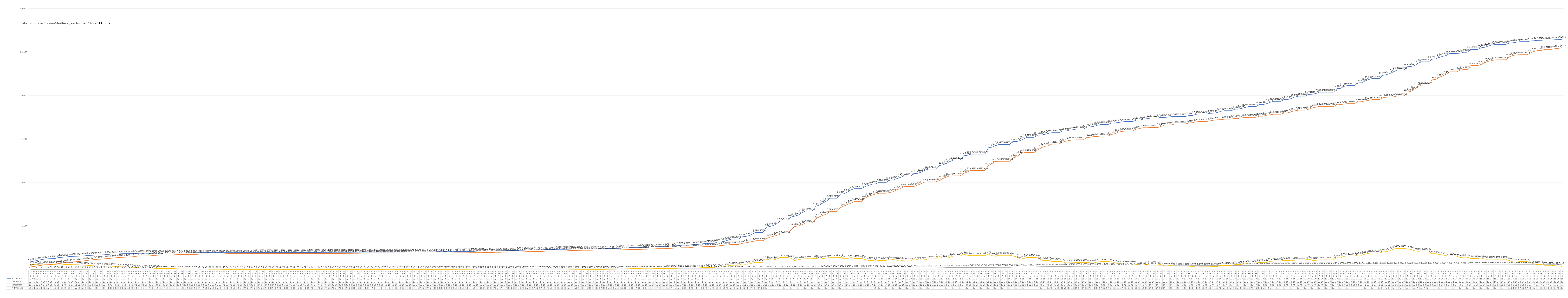
| Category | Positiv Getestete | Genesene | Verstorbene | Aktive Fälle |
|---|---|---|---|---|
| 3/31/20 | 922 | 322 | 15 | 585 |
| 4/1/20 | 980 | 364 | 16 | 600 |
| 4/2/20 | 1081 | 435 | 21 | 625 |
| 4/3/20 | 1155 | 494 | 27 | 634 |
| 4/4/20 | 1213 | 560 | 27 | 626 |
| 4/5/20 | 1259 | 578 | 27 | 654 |
| 4/6/20 | 1272 | 595 | 35 | 642 |
| 4/7/20 | 1295 | 662 | 35 | 598 |
| 4/8/20 | 1399 | 699 | 36 | 664 |
| 4/9/20 | 1426 | 755 | 41 | 630 |
| 4/10/20 | 1465 | 826 | 48 | 591 |
| 4/11/20 | 1508 | 854 | 50 | 604 |
| 4/12/20 | 1532 | 906 | 51 | 575 |
| 4/13/20 | 1547 | 922 | 51 | 574 |
| 4/14/20 | 1557 | 949 | 52 | 556 |
| 4/15/20 | 1583 | 1009 | 54 | 520 |
| 4/16/20 | 1623 | 1058 | 56 | 509 |
| 4/17/20 | 1650 | 1112 | 59 | 479 |
| 4/18/20 | 1669 | 1159 | 62 | 448 |
| 4/19/20 | 1693 | 1195 | 62 | 436 |
| 4/20/20 | 1707 | 1201 | 63 | 443 |
| 4/21/20 | 1719 | 1256 | 65 | 398 |
| 4/22/20 | 1754 | 1281 | 70 | 403 |
| 4/23/20 | 1797 | 1324 | 73 | 400 |
| 4/24/20 | 1812 | 1357 | 74 | 381 |
| 4/25/20 | 1824 | 1412 | 75 | 337 |
| 4/26/20 | 1835 | 1420 | 76 | 339 |
| 4/27/20 | 1839 | 1435 | 76 | 328 |
| 4/28/20 | 1845 | 1467 | 78 | 300 |
| 4/29/20 | 1853 | 1490 | 79 | 284 |
| 4/30/20 | 1866 | 1535 | 82 | 249 |
| 5/1/20 | 1891 | 1591 | 83 | 217 |
| 5/2/20 | 1891 | 1591 | 83 | 217 |
| 5/3/20 | 1891 | 1591 | 83 | 217 |
| 5/4/20 | 1885 | 1598 | 83 | 204 |
| 5/5/20 | 1890 | 1636 | 84 | 170 |
| 5/6/20 | 1895 | 1664 | 84 | 147 |
| 5/7/20 | 1903 | 1682 | 85 | 136 |
| 5/8/20 | 1909 | 1702 | 85 | 122 |
| 5/9/20 | 1909 | 1702 | 85 | 122 |
| 5/10/20 | 1909 | 1702 | 85 | 122 |
| 5/11/20 | 1924 | 1721 | 86 | 117 |
| 5/12/20 | 1929 | 1736 | 87 | 106 |
| 5/13/20 | 1934 | 1743 | 87 | 104 |
| 5/14/20 | 1941 | 1753 | 87 | 101 |
| 5/15/20 | 1945 | 1764 | 88 | 93 |
| 5/16/20 | 1945 | 1764 | 88 | 93 |
| 5/17/20 | 1945 | 1764 | 88 | 93 |
| 5/18/20 | 1951 | 1784 | 88 | 79 |
| 5/19/20 | 1952 | 1791 | 89 | 72 |
| 5/20/20 | 1958 | 1801 | 91 | 66 |
| 5/21/20 | 1960 | 1814 | 91 | 55 |
| 5/22/20 | 1960 | 1814 | 91 | 55 |
| 5/23/20 | 1960 | 1814 | 91 | 55 |
| 5/24/20 | 1960 | 1814 | 91 | 55 |
| 5/25/20 | 1960 | 1829 | 91 | 40 |
| 5/26/20 | 1960 | 1839 | 91 | 30 |
| 5/27/20 | 1962 | 1846 | 92 | 24 |
| 5/28/20 | 1964 | 1849 | 92 | 23 |
| 5/29/20 | 1967 | 1850 | 93 | 24 |
| 5/30/20 | 1967 | 1850 | 93 | 24 |
| 5/31/20 | 1967 | 1850 | 93 | 24 |
| 6/1/20 | 1967 | 1850 | 93 | 24 |
| 6/2/20 | 1971 | 1856 | 93 | 22 |
| 6/3/20 | 1972 | 1858 | 94 | 20 |
| 6/4/20 | 1975 | 1859 | 94 | 22 |
| 6/5/20 | 1976 | 1859 | 94 | 23 |
| 6/6/20 | 1976 | 1859 | 94 | 23 |
| 6/7/20 | 1976 | 1859 | 94 | 23 |
| 6/8/20 | 1979 | 1862 | 94 | 23 |
| 6/9/20 | 1979 | 1863 | 94 | 22 |
| 6/10/20 | 1980 | 1865 | 95 | 20 |
| 6/11/20 | 1982 | 1869 | 95 | 18 |
| 6/12/20 | 1982 | 1869 | 95 | 18 |
| 6/13/20 | 1982 | 1869 | 95 | 18 |
| 6/14/20 | 1982 | 1869 | 95 | 18 |
| 6/15/20 | 1982 | 1871 | 95 | 16 |
| 6/16/20 | 1982 | 1871 | 95 | 16 |
| 6/17/20 | 1985 | 1871 | 95 | 19 |
| 6/18/20 | 1985 | 1871 | 95 | 19 |
| 6/19/20 | 1991 | 1873 | 97 | 21 |
| 6/20/20 | 1991 | 1873 | 97 | 21 |
| 6/21/20 | 1991 | 1873 | 97 | 21 |
| 6/22/20 | 1994 | 1875 | 97 | 22 |
| 6/23/20 | 1994 | 1875 | 97 | 22 |
| 6/24/20 | 1997 | 1876 | 98 | 23 |
| 6/25/20 | 1999 | 1880 | 98 | 21 |
| 6/26/20 | 1999 | 1880 | 98 | 21 |
| 6/27/20 | 1999 | 1880 | 98 | 21 |
| 6/28/20 | 1999 | 1880 | 98 | 21 |
| 6/29/20 | 2001 | 1883 | 98 | 20 |
| 6/30/20 | 2001 | 1883 | 98 | 20 |
| 7/1/20 | 2004 | 1890 | 98 | 16 |
| 7/2/20 | 2004 | 1890 | 98 | 16 |
| 7/3/20 | 2009 | 1898 | 98 | 13 |
| 7/4/20 | 2009 | 1898 | 98 | 13 |
| 7/5/20 | 2009 | 1898 | 98 | 13 |
| 7/6/20 | 2010 | 1900 | 98 | 12 |
| 7/7/20 | 2010 | 1900 | 99 | 11 |
| 7/8/20 | 2010 | 1900 | 99 | 11 |
| 7/9/20 | 2010 | 1900 | 99 | 11 |
| 7/10/20 | 2011 | 1908 | 100 | 3 |
| 7/11/20 | 2011 | 1908 | 100 | 3 |
| 7/12/20 | 2011 | 1908 | 100 | 3 |
| 7/13/20 | 2021 | 1908 | 100 | 13 |
| 7/14/20 | 2021 | 1908 | 100 | 13 |
| 7/15/20 | 2025 | 1909 | 100 | 16 |
| 7/16/20 | 2025 | 1909 | 100 | 16 |
| 7/17/20 | 2030 | 1917 | 100 | 13 |
| 7/18/20 | 2030 | 1917 | 100 | 13 |
| 7/19/20 | 2030 | 1917 | 100 | 13 |
| 7/20/20 | 2037 | 1917 | 100 | 20 |
| 7/21/20 | 2037 | 1917 | 100 | 20 |
| 7/22/20 | 2044 | 1920 | 100 | 24 |
| 7/23/20 | 2044 | 1920 | 100 | 24 |
| 7/24/20 | 2058 | 1922 | 100 | 36 |
| 7/25/20 | 2067 | 1928 | 100 | 39 |
| 7/26/20 | 2067 | 1928 | 100 | 39 |
| 7/27/20 | 2067 | 1928 | 100 | 39 |
| 7/28/20 | 2067 | 1928 | 100 | 39 |
| 7/29/20 | 2076 | 1937 | 100 | 39 |
| 7/30/20 | 2095 | 1942 | 100 | 53 |
| 7/31/20 | 2095 | 1942 | 100 | 53 |
| 8/1/20 | 2095 | 1942 | 100 | 53 |
| 8/2/20 | 2095 | 1942 | 100 | 53 |
| 8/3/20 | 2108 | 1954 | 100 | 54 |
| 8/4/20 | 2108 | 1954 | 100 | 54 |
| 8/5/20 | 2139 | 1958 | 100 | 81 |
| 8/6/20 | 2139 | 1958 | 100 | 81 |
| 8/7/20 | 2157 | 1975 | 100 | 82 |
| 8/8/20 | 2157 | 1975 | 100 | 82 |
| 8/9/20 | 2157 | 1975 | 100 | 82 |
| 8/10/20 | 2170 | 1999 | 100 | 71 |
| 8/11/20 | 2170 | 1999 | 100 | 71 |
| 8/12/20 | 2181 | 2008 | 101 | 72 |
| 8/13/20 | 2181 | 2008 | 101 | 72 |
| 8/14/20 | 2212 | 2028 | 101 | 83 |
| 8/15/20 | 2212 | 2028 | 101 | 83 |
| 8/16/20 | 2212 | 2028 | 101 | 83 |
| 8/17/20 | 2232 | 2053 | 101 | 78 |
| 8/18/20 | 2232 | 2053 | 101 | 78 |
| 8/19/20 | 2261 | 2074 | 102 | 85 |
| 8/20/20 | 2261 | 2074 | 102 | 85 |
| 8/21/20 | 2281 | 2087 | 102 | 92 |
| 8/22/20 | 2281 | 2087 | 102 | 92 |
| 8/23/20 | 2281 | 2087 | 102 | 92 |
| 8/24/20 | 2311 | 2120 | 102 | 89 |
| 8/25/20 | 2324 | 2149 | 102 | 73 |
| 8/26/20 | 2324 | 2149 | 102 | 73 |
| 8/27/20 | 2324 | 2149 | 102 | 73 |
| 8/28/20 | 2348 | 2163 | 102 | 83 |
| 8/29/20 | 2348 | 2163 | 102 | 83 |
| 8/30/20 | 2348 | 2163 | 102 | 83 |
| 8/31/20 | 2353 | 2193 | 102 | 58 |
| 9/1/20 | 2363 | 2203 | 103 | 57 |
| 9/2/20 | 2370 | 2216 | 103 | 51 |
| 9/3/20 | 2378 | 2224 | 103 | 51 |
| 9/4/20 | 2384 | 2235 | 103 | 46 |
| 9/5/20 | 2384 | 2235 | 103 | 46 |
| 9/6/20 | 2384 | 2235 | 103 | 46 |
| 9/7/20 | 2389 | 2247 | 103 | 39 |
| 9/8/20 | 2393 | 2258 | 103 | 32 |
| 9/9/20 | 2400 | 2260 | 103 | 37 |
| 9/10/20 | 2412 | 2263 | 103 | 46 |
| 9/11/20 | 2429 | 2271 | 103 | 55 |
| 9/12/20 | 2429 | 2271 | 103 | 55 |
| 9/13/20 | 2429 | 2271 | 103 | 55 |
| 9/14/20 | 2459 | 2283 | 103 | 73 |
| 9/15/20 | 2477 | 2288 | 103 | 86 |
| 9/16/20 | 2503 | 2297 | 103 | 103 |
| 9/17/20 | 2522 | 2309 | 103 | 110 |
| 9/18/20 | 2550 | 2326 | 103 | 121 |
| 9/19/20 | 2550 | 2326 | 103 | 121 |
| 9/20/20 | 2550 | 2326 | 103 | 121 |
| 9/21/20 | 2568 | 2350 | 104 | 114 |
| 9/22/20 | 2568 | 2350 | 104 | 114 |
| 9/23/20 | 2600 | 2387 | 104 | 109 |
| 9/24/20 | 2621 | 2398 | 104 | 119 |
| 9/25/20 | 2643 | 2415 | 104 | 124 |
| 9/26/20 | 2643 | 2415 | 104 | 124 |
| 9/27/20 | 2643 | 2415 | 104 | 124 |
| 9/28/20 | 2707 | 2442 | 105 | 160 |
| 9/29/20 | 2718 | 2464 | 105 | 149 |
| 9/30/20 | 2734 | 2476 | 106 | 152 |
| 10/1/20 | 2776 | 2495 | 106 | 175 |
| 10/2/20 | 2812 | 2524 | 106 | 182 |
| 10/3/20 | 2812 | 2524 | 106 | 182 |
| 10/4/20 | 2812 | 2524 | 106 | 182 |
| 10/5/20 | 2883 | 2571 | 106 | 206 |
| 10/6/20 | 2891 | 2601 | 107 | 183 |
| 10/7/20 | 2936 | 2617 | 107 | 212 |
| 10/8/20 | 2988 | 2638 | 107 | 243 |
| 10/9/20 | 3027 | 2664 | 109 | 254 |
| 10/10/20 | 3027 | 2664 | 109 | 254 |
| 10/11/20 | 3027 | 2664 | 109 | 254 |
| 10/12/20 | 3167 | 2723 | 109 | 335 |
| 10/13/20 | 3188 | 2772 | 109 | 307 |
| 10/14/20 | 3257 | 2806 | 109 | 342 |
| 10/15/20 | 3393 | 2845 | 109 | 439 |
| 10/16/20 | 3509 | 2891 | 109 | 509 |
| 10/17/20 | 3509 | 2891 | 109 | 509 |
| 10/18/20 | 3509 | 2891 | 109 | 509 |
| 10/19/20 | 3778 | 3016 | 110 | 652 |
| 10/20/20 | 3816 | 3084 | 110 | 622 |
| 10/21/20 | 3912 | 3157 | 110 | 645 |
| 10/22/20 | 4103 | 3237 | 111 | 755 |
| 10/23/20 | 4288 | 3330 | 111 | 847 |
| 10/24/20 | 4288 | 3330 | 111 | 847 |
| 10/25/20 | 4288 | 3330 | 111 | 847 |
| 10/26/20 | 4889 | 3574 | 111 | 1204 |
| 10/27/20 | 4969 | 3734 | 116 | 1119 |
| 10/28/20 | 5082 | 3840 | 119 | 1123 |
| 10/29/20 | 5316 | 3953 | 122 | 1241 |
| 10/30/20 | 5612 | 4093 | 124 | 1395 |
| 10/31/20 | 5612 | 4093 | 124 | 1395 |
| 11/1/20 | 5612 | 4093 | 124 | 1395 |
| 11/2/20 | 6061 | 4610 | 125 | 1326 |
| 11/3/20 | 6153 | 4966 | 129 | 1058 |
| 11/4/20 | 6278 | 5013 | 130 | 1135 |
| 11/5/20 | 6519 | 5166 | 130 | 1223 |
| 11/6/20 | 6748 | 5360 | 132 | 1256 |
| 11/7/20 | 6748 | 5360 | 132 | 1256 |
| 11/8/20 | 6748 | 5360 | 132 | 1256 |
| 11/9/20 | 7273 | 5831 | 132 | 1310 |
| 11/10/20 | 7426 | 6076 | 140 | 1210 |
| 11/11/20 | 7658 | 6237 | 142 | 1279 |
| 11/12/20 | 7871 | 6394 | 143 | 1334 |
| 11/13/20 | 8211 | 6683 | 143 | 1385 |
| 11/14/20 | 8211 | 6683 | 143 | 1385 |
| 11/15/20 | 8211 | 6683 | 143 | 1385 |
| 11/16/20 | 8681 | 7124 | 143 | 1414 |
| 11/17/20 | 8728 | 7322 | 148 | 1258 |
| 11/18/20 | 8920 | 7498 | 148 | 1274 |
| 11/19/20 | 9179 | 7631 | 156 | 1392 |
| 11/20/20 | 9311 | 7849 | 162 | 1300 |
| 11/21/20 | 9311 | 7849 | 162 | 1300 |
| 11/22/20 | 9311 | 7849 | 162 | 1300 |
| 11/23/20 | 9565 | 8230 | 164 | 1171 |
| 11/24/20 | 9676 | 8447 | 168 | 1061 |
| 11/25/20 | 9827 | 8576 | 172 | 1079 |
| 11/26/20 | 9867 | 8698 | 175 | 994 |
| 11/27/20 | 10038 | 8786 | 178 | 1074 |
| 11/28/20 | 10038 | 8786 | 178 | 1074 |
| 11/29/20 | 10038 | 8786 | 178 | 1074 |
| 11/30/20 | 10289 | 8868 | 182 | 1239 |
| 12/1/20 | 10316 | 8968 | 184 | 1164 |
| 12/2/20 | 10460 | 9194 | 188 | 1078 |
| 12/3/20 | 10605 | 9314 | 191 | 1100 |
| 12/4/20 | 10764 | 9548 | 196 | 1020 |
| 12/5/20 | 10764 | 9548 | 196 | 1020 |
| 12/6/20 | 10764 | 9548 | 196 | 1020 |
| 12/7/20 | 11053 | 9586 | 197 | 1270 |
| 12/8/20 | 11080 | 9730 | 211 | 1139 |
| 12/9/20 | 11222 | 9915 | 213 | 1094 |
| 12/10/20 | 11442 | 10086 | 213 | 1143 |
| 12/11/20 | 11557 | 10095 | 214 | 1248 |
| 12/12/20 | 11557 | 10095 | 214 | 1248 |
| 12/13/20 | 11557 | 10095 | 214 | 1248 |
| 12/14/20 | 11970 | 10237 | 219 | 1514 |
| 12/15/20 | 12025 | 10461 | 219 | 1345 |
| 12/16/20 | 12197 | 10640 | 232 | 1325 |
| 12/17/20 | 12415 | 10773 | 240 | 1402 |
| 12/18/20 | 12592 | 10783 | 242 | 1567 |
| 12/19/20 | 12592 | 10783 | 242 | 1567 |
| 12/20/20 | 12592 | 10783 | 242 | 1567 |
| 12/21/20 | 13089 | 11054 | 246 | 1789 |
| 12/22/20 | 13144 | 11232 | 246 | 1666 |
| 12/23/20 | 13276 | 11409 | 256 | 1611 |
| 12/24/20 | 13276 | 11409 | 256 | 1611 |
| 12/25/20 | 13276 | 11409 | 256 | 1611 |
| 12/26/20 | 13276 | 11409 | 256 | 1611 |
| 12/27/20 | 13276 | 11409 | 256 | 1611 |
| 12/28/20 | 14012 | 11950 | 263 | 1799 |
| 12/29/20 | 14078 | 12189 | 265 | 1624 |
| 12/30/20 | 14248 | 12435 | 272 | 1541 |
| 12/31/20 | 14395 | 12460 | 276 | 1659 |
| 1/1/21 | 14395 | 12460 | 276 | 1659 |
| 1/2/21 | 14395 | 12460 | 276 | 1659 |
| 1/3/21 | 14395 | 12460 | 276 | 1659 |
| 1/4/21 | 14721 | 12848 | 292 | 1581 |
| 1/5/21 | 14723 | 12949 | 301 | 1473 |
| 1/6/21 | 14832 | 13293 | 310 | 1229 |
| 1/7/21 | 15028 | 13437 | 319 | 1272 |
| 1/8/21 | 15211 | 13473 | 325 | 1413 |
| 1/9/21 | 15211 | 13473 | 325 | 1413 |
| 1/10/21 | 15211 | 13473 | 325 | 1413 |
| 1/11/21 | 15460 | 13759 | 335 | 1366 |
| 1/12/21 | 15469 | 14015 | 340 | 1114 |
| 1/13/21 | 15548 | 14173 | 347 | 1028 |
| 1/14/21 | 15657 | 14233 | 347 | 1077 |
| 1/15/21 | 15745 | 14431 | 359 | 955 |
| 1/16/21 | 15745 | 14431 | 359 | 955 |
| 1/17/21 | 15745 | 14431 | 359 | 955 |
| 1/18/21 | 15931 | 14657 | 362 | 912 |
| 1/19/21 | 15933 | 14772 | 370 | 791 |
| 1/20/21 | 16037 | 14857 | 380 | 800 |
| 1/21/21 | 16081 | 14908 | 390 | 783 |
| 1/22/21 | 16164 | 14930 | 393 | 841 |
| 1/23/21 | 16164 | 14930 | 393 | 841 |
| 1/24/21 | 16164 | 14930 | 393 | 841 |
| 1/25/21 | 16399 | 15168 | 393 | 838 |
| 1/26/21 | 16415 | 15229 | 398 | 788 |
| 1/27/21 | 16478 | 15299 | 399 | 780 |
| 1/28/21 | 16602 | 15315 | 399 | 888 |
| 1/29/21 | 16688 | 15360 | 405 | 923 |
| 1/30/21 | 16688 | 15360 | 405 | 923 |
| 1/31/21 | 16688 | 15360 | 405 | 923 |
| 2/1/21 | 16866 | 15540 | 416 | 910 |
| 2/2/21 | 16871 | 15644 | 417 | 810 |
| 2/3/21 | 16914 | 15817 | 420 | 677 |
| 2/4/21 | 16984 | 15886 | 420 | 678 |
| 2/5/21 | 17029 | 15937 | 427 | 665 |
| 2/6/21 | 17029 | 15937 | 427 | 665 |
| 2/7/21 | 17029 | 15937 | 427 | 665 |
| 2/8/21 | 17191 | 16150 | 430 | 611 |
| 2/9/21 | 17198 | 16225 | 435 | 538 |
| 2/10/21 | 17301 | 16316 | 437 | 548 |
| 2/11/21 | 17352 | 16314 | 437 | 601 |
| 2/12/21 | 17416 | 16328 | 443 | 645 |
| 2/13/21 | 17416 | 16328 | 443 | 645 |
| 2/14/21 | 17416 | 16328 | 443 | 645 |
| 2/15/21 | 17499 | 16463 | 447 | 589 |
| 2/16/21 | 17502 | 16612 | 447 | 443 |
| 2/17/21 | 17530 | 16635 | 448 | 447 |
| 2/18/21 | 17582 | 16651 | 448 | 483 |
| 2/19/21 | 17611 | 16744 | 455 | 412 |
| 2/20/21 | 17611 | 16744 | 455 | 412 |
| 2/21/21 | 17611 | 16744 | 455 | 412 |
| 2/22/21 | 17611 | 16744 | 455 | 412 |
| 2/23/21 | 17720 | 16859 | 455 | 406 |
| 2/24/21 | 17722 | 16899 | 457 | 366 |
| 2/25/21 | 17858 | 16987 | 465 | 406 |
| 2/26/21 | 17896 | 17033 | 465 | 398 |
| 2/27/21 | 17896 | 17033 | 465 | 398 |
| 2/28/21 | 17896 | 17033 | 465 | 398 |
| 3/1/21 | 17971 | 17110 | 466 | 395 |
| 3/2/21 | 17984 | 17178 | 466 | 340 |
| 3/3/21 | 18062 | 17228 | 468 | 366 |
| 3/4/21 | 18194 | 17244 | 470 | 480 |
| 3/5/21 | 18266 | 17295 | 470 | 501 |
| 3/6/21 | 18266 | 17295 | 470 | 501 |
| 3/7/21 | 18266 | 17295 | 470 | 501 |
| 3/8/21 | 18445 | 17383 | 473 | 589 |
| 3/9/21 | 18451 | 17388 | 474 | 589 |
| 3/10/21 | 18548 | 17451 | 474 | 623 |
| 3/11/21 | 18651 | 17493 | 475 | 683 |
| 3/12/21 | 18747 | 17508 | 476 | 763 |
| 3/13/21 | 18747 | 17508 | 476 | 763 |
| 3/14/21 | 18747 | 17508 | 476 | 763 |
| 3/15/21 | 18967 | 17633 | 479 | 855 |
| 3/16/21 | 18970 | 17638 | 481 | 851 |
| 3/17/21 | 19075 | 17749 | 482 | 844 |
| 3/18/21 | 19232 | 17800 | 482 | 950 |
| 3/19/21 | 19348 | 17864 | 484 | 1000 |
| 3/20/21 | 19348 | 17864 | 484 | 1000 |
| 3/21/21 | 19348 | 17864 | 484 | 1000 |
| 3/22/21 | 19559 | 18009 | 486 | 1064 |
| 3/23/21 | 19563 | 18017 | 489 | 1057 |
| 3/24/21 | 19663 | 18151 | 490 | 1022 |
| 3/25/21 | 19832 | 18252 | 491 | 1089 |
| 3/26/21 | 19939 | 18325 | 493 | 1121 |
| 3/27/21 | 19939 | 18325 | 493 | 1121 |
| 3/28/21 | 19939 | 18325 | 493 | 1121 |
| 3/29/21 | 20141 | 18444 | 493 | 1204 |
| 3/30/21 | 20162 | 18593 | 495 | 1074 |
| 3/31/21 | 20247 | 18675 | 495 | 1077 |
| 4/1/21 | 20398 | 18766 | 495 | 1137 |
| 4/2/21 | 20398 | 18766 | 495 | 1137 |
| 4/3/21 | 20398 | 18766 | 495 | 1137 |
| 4/4/21 | 20398 | 18766 | 495 | 1137 |
| 4/5/21 | 20398 | 18766 | 495 | 1137 |
| 4/6/21 | 20818 | 18950 | 499 | 1369 |
| 4/7/21 | 20835 | 18974 | 499 | 1362 |
| 4/8/21 | 21070 | 19035 | 504 | 1531 |
| 4/9/21 | 21163 | 19079 | 505 | 1579 |
| 4/10/21 | 21163 | 19079 | 505 | 1579 |
| 4/11/21 | 21163 | 19079 | 505 | 1579 |
| 4/12/21 | 21473 | 19285 | 505 | 1683 |
| 4/13/21 | 21482 | 19309 | 510 | 1663 |
| 4/14/21 | 21688 | 19390 | 515 | 1783 |
| 4/15/21 | 21861 | 19457 | 516 | 1888 |
| 4/16/21 | 21963 | 19544 | 518 | 1901 |
| 4/17/21 | 21963 | 19544 | 518 | 1901 |
| 4/18/21 | 21963 | 19544 | 518 | 1901 |
| 4/19/21 | 22329 | 19753 | 523 | 2053 |
| 4/20/21 | 22407 | 19820 | 523 | 2064 |
| 4/21/21 | 22536 | 19838 | 523 | 2175 |
| 4/22/21 | 22736 | 19860 | 524 | 2352 |
| 4/23/21 | 22926 | 19951 | 524 | 2451 |
| 4/24/21 | 22926 | 19951 | 524 | 2451 |
| 4/25/21 | 22926 | 19951 | 524 | 2451 |
| 4/26/21 | 23325 | 20410 | 525 | 2390 |
| 4/27/21 | 23349 | 20496 | 525 | 2328 |
| 4/28/21 | 23454 | 20743 | 528 | 2183 |
| 4/29/21 | 23708 | 21070 | 531 | 2107 |
| 4/30/21 | 23886 | 21205 | 532 | 2149 |
| 5/1/21 | 23887 | 21206 | 532 | 2149 |
| 5/2/21 | 23888 | 21207 | 532 | 2149 |
| 5/3/21 | 24183 | 21817 | 534 | 1832 |
| 5/4/21 | 24236 | 21855 | 538 | 1843 |
| 5/5/21 | 24385 | 22099 | 541 | 1745 |
| 5/6/21 | 24512 | 22268 | 543 | 1701 |
| 5/7/21 | 24611 | 22456 | 543 | 1612 |
| 5/8/21 | 24849 | 22741 | 547 | 1561 |
| 5/9/21 | 24849 | 22741 | 547 | 1561 |
| 5/10/21 | 24849 | 22741 | 547 | 1561 |
| 5/11/21 | 24885 | 22930 | 549 | 1406 |
| 5/12/21 | 24988 | 23004 | 549 | 1435 |
| 5/13/21 | 24988 | 23004 | 549 | 1435 |
| 5/14/21 | 25306 | 23458 | 554 | 1294 |
| 5/15/21 | 25307 | 23459 | 554 | 1294 |
| 5/16/21 | 25308 | 23460 | 554 | 1294 |
| 5/17/21 | 25503 | 23595 | 557 | 1351 |
| 5/18/21 | 25559 | 23799 | 560 | 1200 |
| 5/19/21 | 25704 | 23943 | 560 | 1201 |
| 5/20/21 | 25820 | 24030 | 560 | 1230 |
| 5/21/21 | 25884 | 24122 | 562 | 1200 |
| 5/22/21 | 25885 | 24123 | 562 | 1200 |
| 5/23/21 | 25886 | 24124 | 562 | 1200 |
| 5/24/21 | 25887 | 24125 | 562 | 1200 |
| 5/25/21 | 26059 | 24464 | 562 | 1033 |
| 5/26/21 | 26077 | 24616 | 565 | 896 |
| 5/27/21 | 26143 | 24685 | 568 | 890 |
| 5/28/21 | 26200 | 24704 | 568 | 928 |
| 5/29/21 | 26201 | 24705 | 568 | 928 |
| 5/30/21 | 26202 | 24706 | 568 | 928 |
| 5/31/21 | 26290 | 24913 | 570 | 807 |
| 6/1/21 | 26311 | 25083 | 570 | 658 |
| 6/2/21 | 26355 | 25174 | 571 | 610 |
| 6/3/21 | 26356 | 25175 | 571 | 610 |
| 6/4/21 | 26400 | 25321 | 574 | 505 |
| 6/5/21 | 26401 | 25322 | 574 | 505 |
| 6/6/21 | 26402 | 25323 | 574 | 505 |
| 6/7/21 | 26428 | 25401 | 575 | 452 |
| 6/8/21 | 26438 | 25438 | 576 | 424 |
| 6/9/21 | 26478 | 25528 | 577 | 373 |